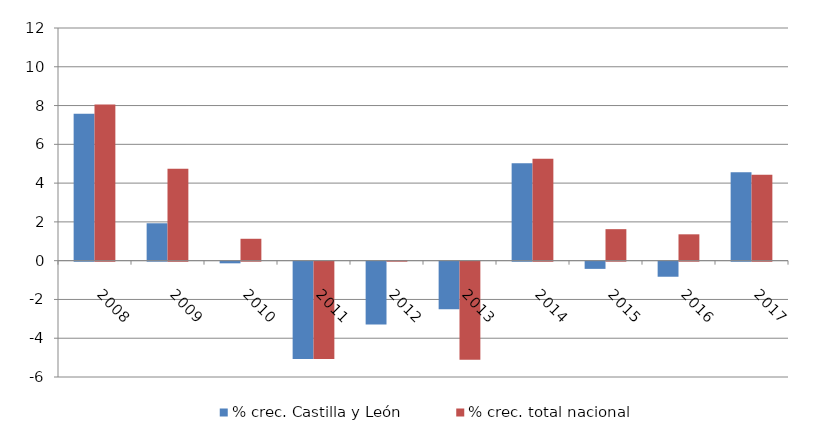
| Category | % crec. Castilla y León | % crec. total nacional |
|---|---|---|
| 2008.0 | 7.581 | 8.052 |
| 2009.0 | 1.929 | 4.738 |
| 2010.0 | -0.085 | 1.129 |
| 2011.0 | -5.015 | -5.019 |
| 2012.0 | -3.236 | 0.024 |
| 2013.0 | -2.453 | -5.061 |
| 2014.0 | 5.022 | 5.255 |
| 2015.0 | -0.371 | 1.625 |
| 2016.0 | -0.777 | 1.359 |
| 2017.0 | 4.566 | 4.427 |